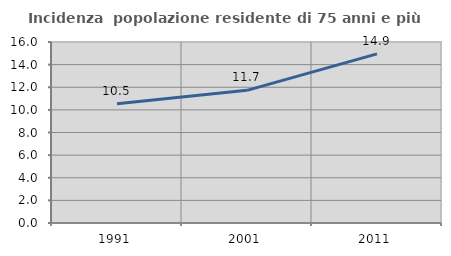
| Category | Incidenza  popolazione residente di 75 anni e più |
|---|---|
| 1991.0 | 10.548 |
| 2001.0 | 11.726 |
| 2011.0 | 14.948 |